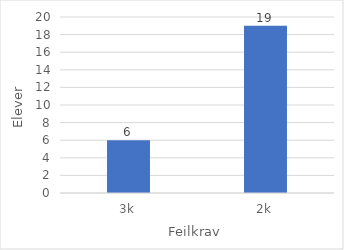
| Category | Series 0 |
|---|---|
| 3k | 6 |
| 2k | 19 |